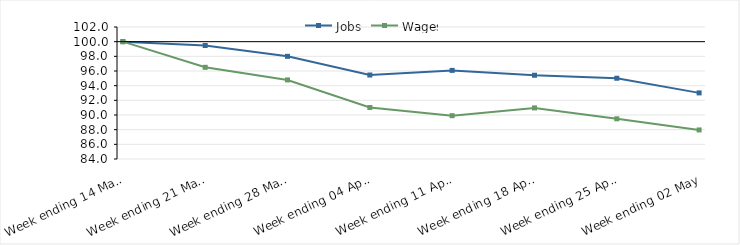
| Category | Jobs | Wages |
|---|---|---|
| 2020-03-14 | 100 | 100 |
| 2020-03-21 | 99.48 | 96.504 |
| 2020-03-28 | 97.999 | 94.782 |
| 2020-04-04 | 95.454 | 91.027 |
| 2020-04-11 | 96.085 | 89.909 |
| 2020-04-18 | 95.421 | 90.97 |
| 2020-04-25 | 95.012 | 89.482 |
| 2020-05-02 | 93.015 | 87.963 |